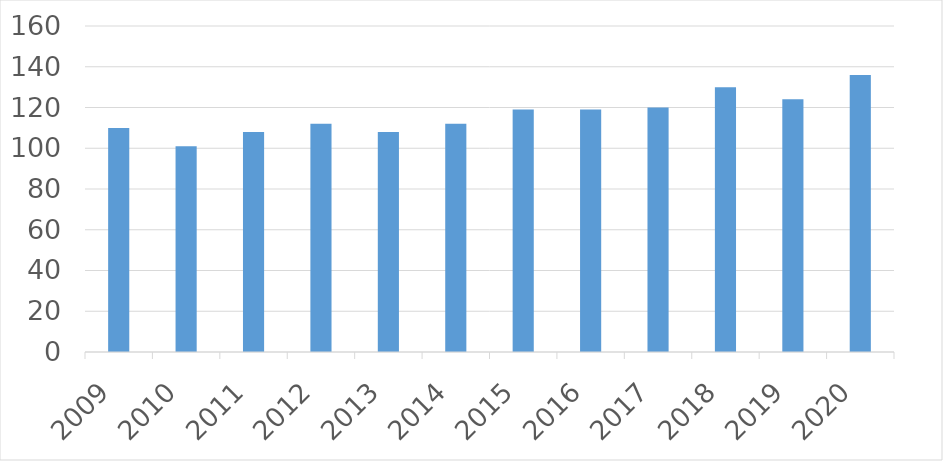
| Category | Series 0 |
|---|---|
| 2009 | 110 |
| 2010 | 101 |
| 2011 | 108 |
| 2012 | 112 |
| 2013 | 108 |
| 2014 | 112 |
| 2015 | 119 |
| 2016 | 119 |
| 2017 | 120 |
| 2018 | 130 |
| 2019 | 124 |
| 2020 | 136 |